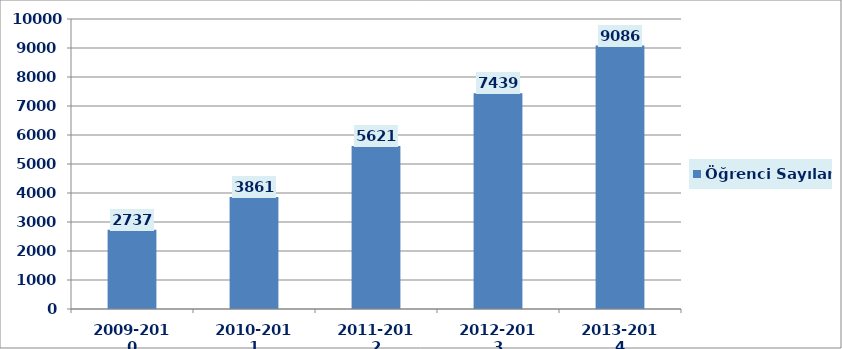
| Category | Öğrenci Sayıları |
|---|---|
| 2009-2010 | 2737 |
| 2010-2011 | 3861 |
| 2011-2012 | 5621 |
| 2012-2013 | 7439 |
| 2013-2014 | 9086 |